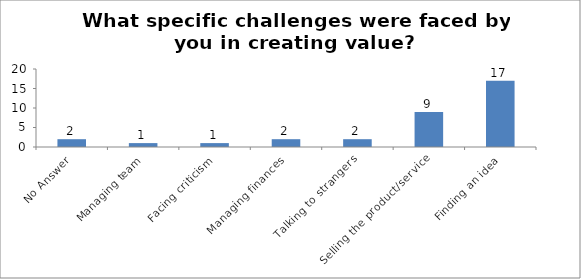
| Category | What specific challenges were faced by you in creating value? |
|---|---|
| No Answer | 2 |
| Managing team | 1 |
| Facing criticism | 1 |
| Managing finances | 2 |
| Talking to strangers | 2 |
| Selling the product/service | 9 |
| Finding an idea | 17 |